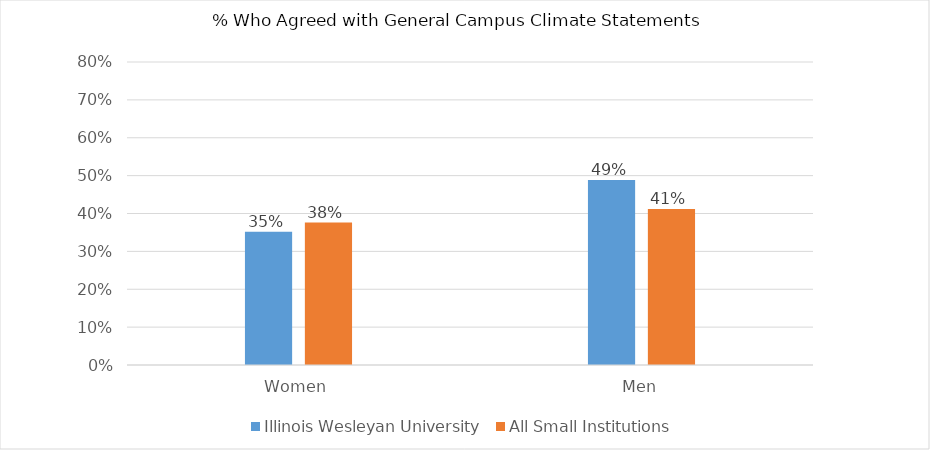
| Category | Illinois Wesleyan University | All Small Institutions |
|---|---|---|
| Women | 0.352 | 0.376 |
| Men | 0.489 | 0.412 |